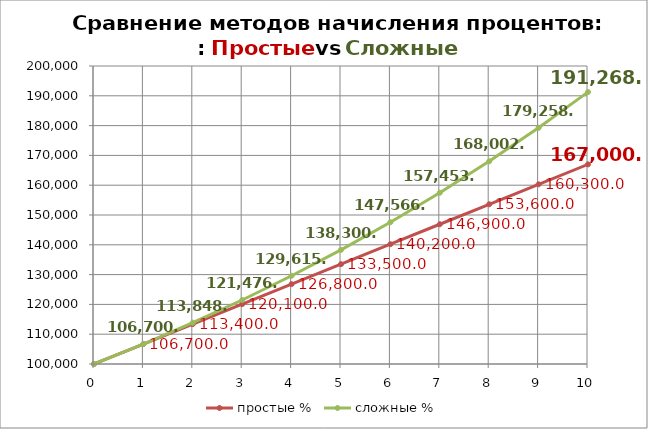
| Category | простые % | сложные % |
|---|---|---|
| 0.0 | 100000 | 100000 |
| 1.0 | 106700 | 106700 |
| 2.0 | 113400 | 113848.9 |
| 3.0 | 120100 | 121476.776 |
| 4.0 | 126800 | 129615.72 |
| 5.0 | 133500 | 138299.974 |
| 6.0 | 140200 | 147566.072 |
| 7.0 | 146900 | 157452.999 |
| 8.0 | 153600 | 168002.35 |
| 9.0 | 160300 | 179258.507 |
| 10.0 | 167000 | 191268.827 |